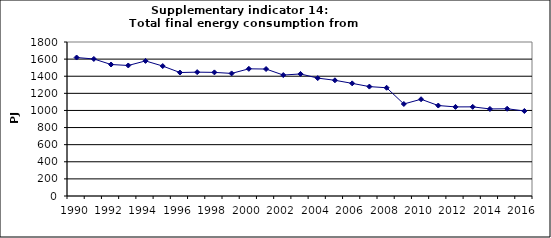
| Category | Total final energy consumption from industry, PJ |
|---|---|
| 1990 | 1618.6 |
| 1991 | 1601.732 |
| 1992 | 1536.999 |
| 1993 | 1525.662 |
| 1994 | 1578.897 |
| 1995 | 1518.823 |
| 1996 | 1443.198 |
| 1997 | 1447.69 |
| 1998 | 1444.955 |
| 1999 | 1432.801 |
| 2000 | 1486.572 |
| 2001 | 1483.912 |
| 2002 | 1413.626 |
| 2003 | 1426.618 |
| 2004 | 1377.978 |
| 2005 | 1352.47 |
| 2006 | 1316.422 |
| 2007 | 1278.661 |
| 2008 | 1265.234 |
| 2009 | 1075.475 |
| 2010 | 1130.888 |
| 2011 | 1057.346 |
| 2012 | 1041.494 |
| 2013 | 1042.066 |
| 2014 | 1017.474 |
| 2015 | 1019.969 |
| 2016 | 993.544 |